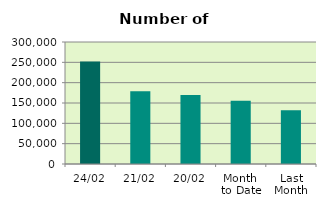
| Category | Series 0 |
|---|---|
| 24/02 | 252228 |
| 21/02 | 179118 |
| 20/02 | 169668 |
| Month 
to Date | 155721.125 |
| Last
Month | 132423.636 |